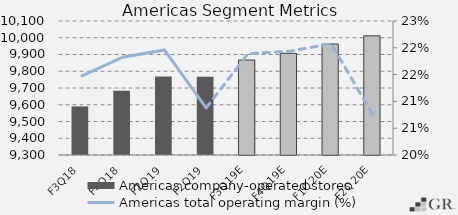
| Category | Americas company-operated stores |
|---|---|
|  F3Q18  | 9590 |
|  F4Q18  | 9684 |
|  F1Q19  | 9768 |
|  F2Q19  | 9767 |
|  F3Q19E  | 9867 |
|  F4Q19E  | 9907 |
|  F1Q20E  | 9962.75 |
|  F2Q20E  | 10011.438 |